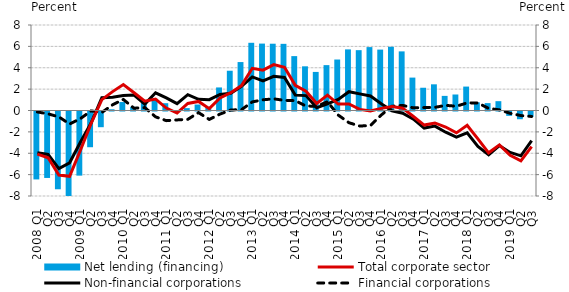
| Category | Net lending (financing) |
|---|---|
| 2008 Q1 | -6.355 |
| Q2 | -6.219 |
| Q3 | -7.276 |
| Q4 | -7.935 |
| 2009 Q1 | -6.001 |
| Q2 | -3.343 |
| Q3 | -1.47 |
| Q4 | 0.115 |
| 2010 Q1 | 0.792 |
| Q2 | 0.344 |
| Q3 | 0.702 |
| Q4 | 1.096 |
| 2011 Q1 | 0.683 |
| Q2 | -0.086 |
| Q3 | 0.222 |
| Q4 | 0.56 |
| 2012 Q1 | 0.348 |
| Q2 | 2.157 |
| Q3 | 3.721 |
| Q4 | 4.532 |
| 2013 Q1 | 6.335 |
| Q2 | 6.261 |
| Q3 | 6.249 |
| Q4 | 6.237 |
| 2014 Q1 | 5.089 |
| Q2 | 4.134 |
| Q3 | 3.609 |
| Q4 | 4.246 |
| 2015 Q1 | 4.77 |
| Q2 | 5.718 |
| Q3 | 5.646 |
| Q4 | 5.932 |
| 2016 Q1 | 5.699 |
| Q2 | 5.964 |
| Q3 | 5.531 |
| Q4 | 3.079 |
| 2017 Q1 | 2.129 |
| Q2 | 2.45 |
| Q3 | 1.368 |
| Q4 | 1.498 |
| 2018 Q1 | 2.239 |
| Q2 | 0.762 |
| Q3 | 0.692 |
| Q4 | 0.873 |
| 2019 Q1 | -0.406 |
| Q2 | -0.725 |
| Q3 | -0.515 |